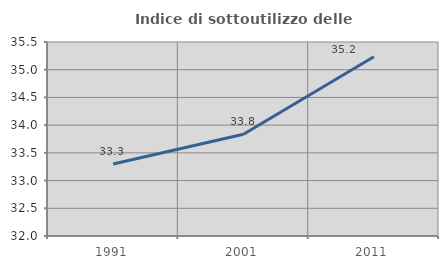
| Category | Indice di sottoutilizzo delle abitazioni  |
|---|---|
| 1991.0 | 33.3 |
| 2001.0 | 33.835 |
| 2011.0 | 35.235 |